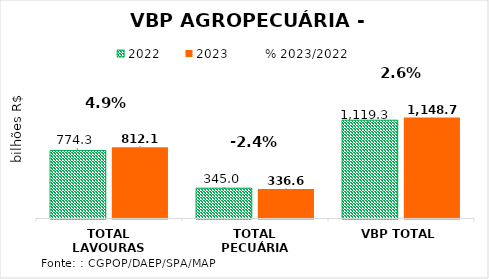
| Category | 2022 | 2023 |
|---|---|---|
| TOTAL LAVOURAS | 774.326 | 812.101 |
| TOTAL PECUÁRIA | 344.998 | 336.598 |
| VBP TOTAL | 1119.324 | 1148.699 |